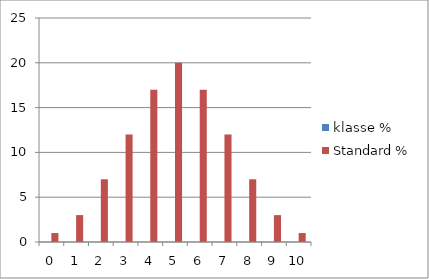
| Category | klasse % | Standard % |
|---|---|---|
| 0.0 | 0 | 1 |
| 1.0 | 0 | 3 |
| 2.0 | 0 | 7 |
| 3.0 | 0 | 12 |
| 4.0 | 0 | 17 |
| 5.0 | 0 | 20 |
| 6.0 | 0 | 17 |
| 7.0 | 0 | 12 |
| 8.0 | 0 | 7 |
| 9.0 | 0 | 3 |
| 10.0 | 0 | 1 |